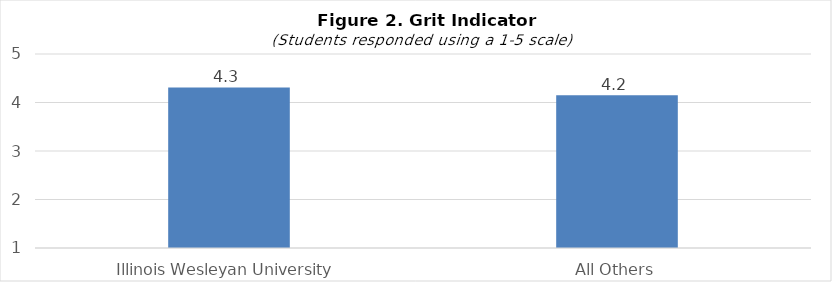
| Category | Series 0 |
|---|---|
| Illinois Wesleyan University | 4.31 |
| All Others | 4.15 |